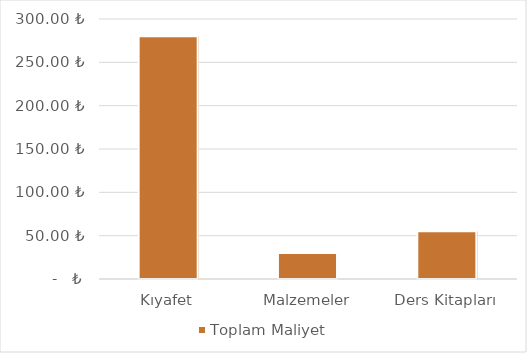
| Category | Toplam Maliyet |
|---|---|
| Kıyafet | 280 |
| Malzemeler | 30 |
| Ders Kitapları | 55 |